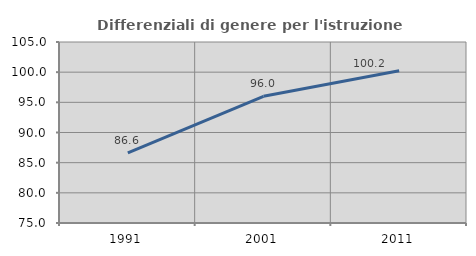
| Category | Differenziali di genere per l'istruzione superiore |
|---|---|
| 1991.0 | 86.631 |
| 2001.0 | 96.003 |
| 2011.0 | 100.222 |